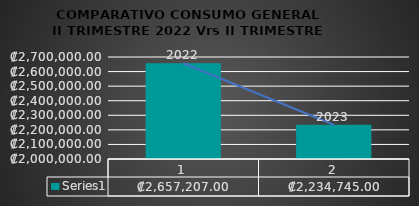
| Category | Series 0 |
|---|---|
| 0 | 2657207 |
| 1 | 2234745 |